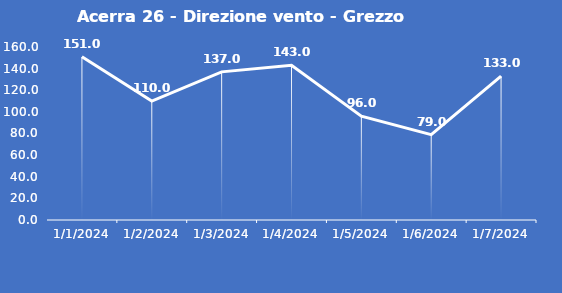
| Category | Acerra 26 - Direzione vento - Grezzo (°N) |
|---|---|
| 1/1/24 | 151 |
| 1/2/24 | 110 |
| 1/3/24 | 137 |
| 1/4/24 | 143 |
| 1/5/24 | 96 |
| 1/6/24 | 79 |
| 1/7/24 | 133 |